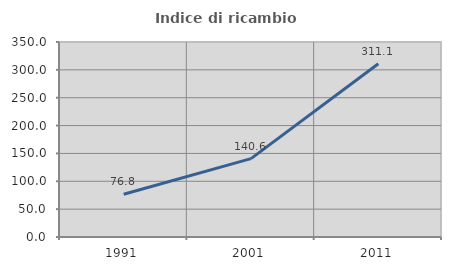
| Category | Indice di ricambio occupazionale  |
|---|---|
| 1991.0 | 76.8 |
| 2001.0 | 140.618 |
| 2011.0 | 311.066 |